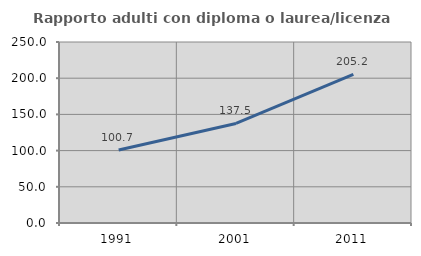
| Category | Rapporto adulti con diploma o laurea/licenza media  |
|---|---|
| 1991.0 | 100.726 |
| 2001.0 | 137.549 |
| 2011.0 | 205.241 |